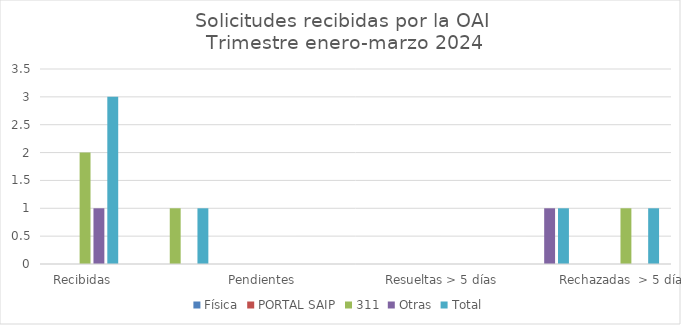
| Category | Física | PORTAL SAIP | 311 | Otras | Total |
|---|---|---|---|---|---|
| Recibidas  | 0 | 0 | 2 | 1 | 3 |
| Cambiadas a otra institución | 0 | 0 | 1 | 0 | 1 |
| Pendientes  | 0 | 0 | 0 | 0 | 0 |
| Resueltas < 5 días | 0 | 0 | 0 | 0 | 0 |
| Resueltas > 5 días  | 0 | 0 | 0 | 0 | 0 |
| Rechazadas  < 5 días | 0 | 0 | 0 | 1 | 1 |
| Rechazadas  > 5 días | 0 | 0 | 1 | 0 | 1 |